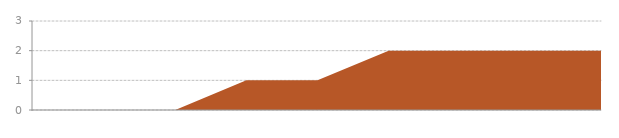
| Category | Series 0 |
|---|---|
| 0 | 0 |
| 1 | 0 |
| 2 | 0 |
| 3 | 1 |
| 4 | 1 |
| 5 | 2 |
| 6 | 2 |
| 7 | 2 |
| 8 | 2 |